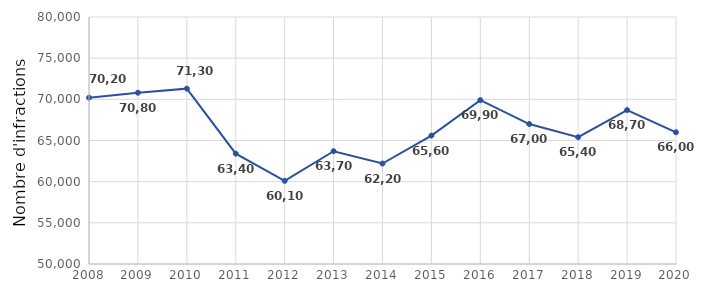
| Category | Series 0 |
|---|---|
| 2008.0 | 70200 |
| 2009.0 | 70800 |
| 2010.0 | 71300 |
| 2011.0 | 63400 |
| 2012.0 | 60100 |
| 2013.0 | 63700 |
| 2014.0 | 62200 |
| 2015.0 | 65600 |
| 2016.0 | 69900 |
| 2017.0 | 67000 |
| 2018.0 | 65400 |
| 2019.0 | 68700 |
| 2020.0 | 66000 |